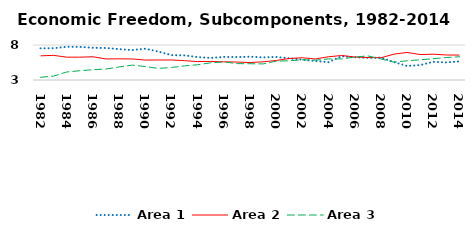
| Category | Area 1 | Area 2 | Area 3 |
|---|---|---|---|
| 1982.0 | 7.525 | 6.453 | 3.387 |
| 1983.0 | 7.537 | 6.518 | 3.558 |
| 1984.0 | 7.751 | 6.265 | 4.146 |
| 1985.0 | 7.731 | 6.261 | 4.325 |
| 1986.0 | 7.603 | 6.32 | 4.468 |
| 1987.0 | 7.569 | 6.009 | 4.564 |
| 1988.0 | 7.413 | 6.025 | 4.863 |
| 1989.0 | 7.278 | 6.007 | 5.128 |
| 1990.0 | 7.469 | 5.846 | 4.917 |
| 1991.0 | 7.063 | 5.861 | 4.66 |
| 1992.0 | 6.554 | 5.86 | 4.784 |
| 1993.0 | 6.518 | 5.761 | 5.016 |
| 1994.0 | 6.273 | 5.633 | 5.182 |
| 1995.0 | 6.154 | 5.651 | 5.451 |
| 1996.0 | 6.302 | 5.598 | 5.583 |
| 1997.0 | 6.277 | 5.566 | 5.343 |
| 1998.0 | 6.322 | 5.494 | 5.323 |
| 1999.0 | 6.233 | 5.597 | 5.297 |
| 2000.0 | 6.294 | 5.786 | 5.692 |
| 2001.0 | 6.098 | 6.074 | 5.746 |
| 2002.0 | 5.902 | 6.176 | 5.893 |
| 2003.0 | 5.725 | 6.008 | 5.834 |
| 2004.0 | 5.548 | 6.32 | 6.01 |
| 2005.0 | 6.4 | 6.5 | 6.014 |
| 2006.0 | 6.254 | 6.288 | 6.267 |
| 2007.0 | 6.162 | 6.213 | 6.447 |
| 2008.0 | 6.199 | 6.175 | 6.012 |
| 2009.0 | 5.566 | 6.696 | 5.547 |
| 2010.0 | 5.005 | 6.934 | 5.746 |
| 2011.0 | 5.134 | 6.635 | 5.887 |
| 2012.0 | 5.597 | 6.684 | 6.043 |
| 2013.0 | 5.511 | 6.572 | 6.205 |
| 2014.0 | 5.661 | 6.558 | 6.324 |